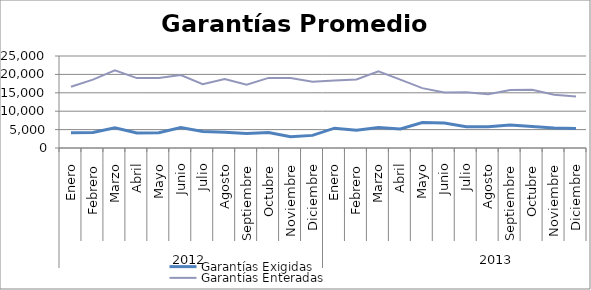
| Category | Garantías Exigidas | Garantías Enteradas |
|---|---|---|
| 0 | 4146.8 | 16662.483 |
| 1 | 4190.531 | 18572.749 |
| 2 | 5482.211 | 21128.648 |
| 3 | 4079.038 | 18997.51 |
| 4 | 4141.554 | 19005.364 |
| 5 | 5549.139 | 19818.91 |
| 6 | 4487.023 | 17351.39 |
| 7 | 4277.924 | 18719.955 |
| 8 | 3940.893 | 17217.403 |
| 9 | 4180.69 | 19046.939 |
| 10 | 3056.997 | 19028.425 |
| 11 | 3426.799 | 17994.819 |
| 12 | 5390.461 | 18317.043 |
| 13 | 4807.91 | 18608.477 |
| 14 | 5582.739 | 20850.446 |
| 15 | 5196.755 | 18583.166 |
| 16 | 6912.615 | 16266.455 |
| 17 | 6790.981 | 15108.06 |
| 18 | 5787.122 | 15161.964 |
| 19 | 5780.082 | 14588.597 |
| 20 | 6263.345 | 15743.621 |
| 21 | 5845.053 | 15824.978 |
| 22 | 5425.404 | 14459.931 |
| 23 | 5306.02 | 14022.359 |